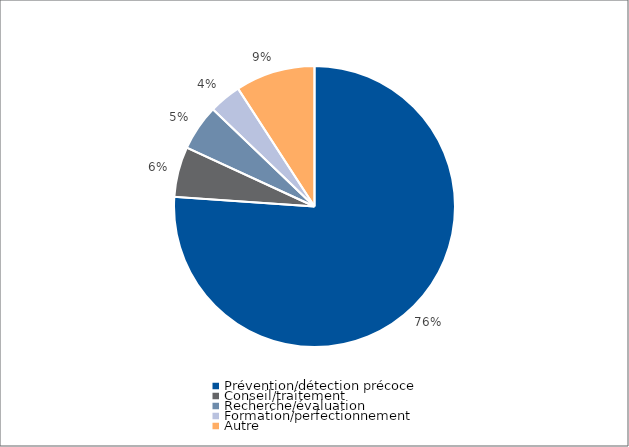
| Category | Series 0 |
|---|---|
| Prévention/détection précoce | 197462.61 |
| Conseil/traitement | 15000 |
| Recherche/évaluation | 13701 |
| Formation/perfectionnement | 9571.81 |
| Autre | 23771.81 |